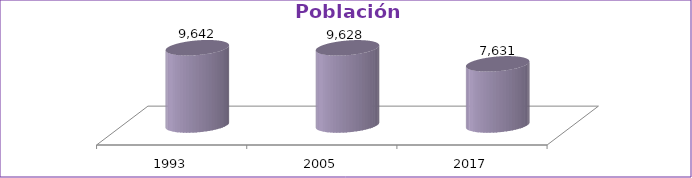
| Category | Población Total |
|---|---|
| 1993 | 9642 |
| 2005 | 9628 |
| 2017 | 7631 |